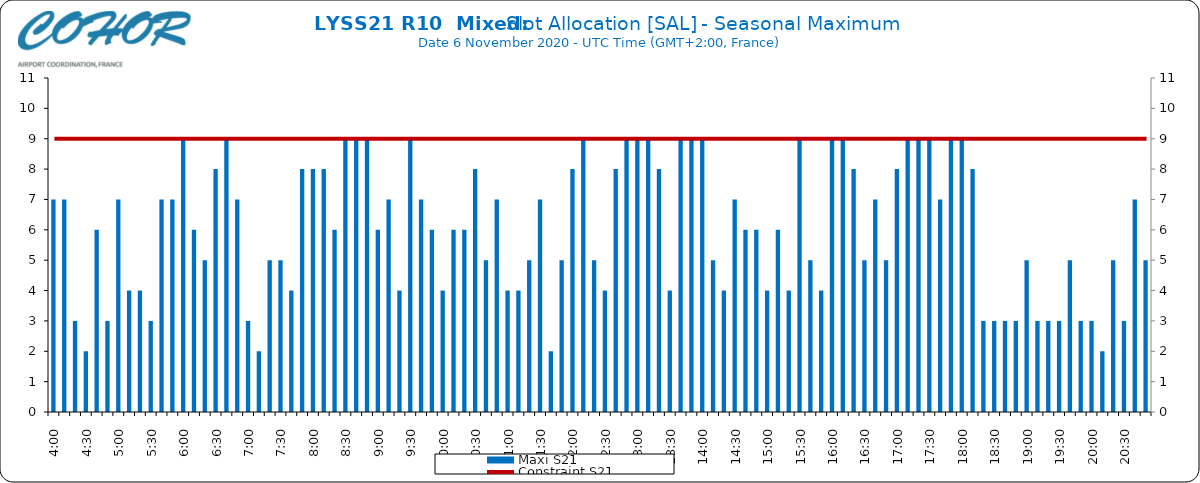
| Category | Maxi S21 |
|---|---|
| 0.16666666666666666 | 7 |
| 0.17361111111111113 | 7 |
| 0.18055555555555555 | 3 |
| 0.1875 | 2 |
| 0.19444444444444445 | 6 |
| 0.20138888888888887 | 3 |
| 0.20833333333333334 | 7 |
| 0.2152777777777778 | 4 |
| 0.2222222222222222 | 4 |
| 0.22916666666666666 | 3 |
| 0.23611111111111113 | 7 |
| 0.24305555555555555 | 7 |
| 0.25 | 9 |
| 0.2569444444444445 | 6 |
| 0.2638888888888889 | 5 |
| 0.2708333333333333 | 8 |
| 0.2777777777777778 | 9 |
| 0.2847222222222222 | 7 |
| 0.2916666666666667 | 3 |
| 0.2986111111111111 | 2 |
| 0.3055555555555555 | 5 |
| 0.3125 | 5 |
| 0.3194444444444445 | 4 |
| 0.3263888888888889 | 8 |
| 0.3333333333333333 | 8 |
| 0.34027777777777773 | 8 |
| 0.34722222222222227 | 6 |
| 0.3541666666666667 | 9 |
| 0.3611111111111111 | 9 |
| 0.3680555555555556 | 9 |
| 0.375 | 6 |
| 0.3819444444444444 | 7 |
| 0.3888888888888889 | 4 |
| 0.3958333333333333 | 9 |
| 0.40277777777777773 | 7 |
| 0.40972222222222227 | 6 |
| 0.4166666666666667 | 4 |
| 0.4236111111111111 | 6 |
| 0.4305555555555556 | 6 |
| 0.4375 | 8 |
| 0.4444444444444444 | 5 |
| 0.4513888888888889 | 7 |
| 0.4583333333333333 | 4 |
| 0.46527777777777773 | 4 |
| 0.47222222222222227 | 5 |
| 0.4791666666666667 | 7 |
| 0.4861111111111111 | 2 |
| 0.4930555555555556 | 5 |
| 0.5 | 8 |
| 0.5069444444444444 | 9 |
| 0.513888888888889 | 5 |
| 0.5208333333333334 | 4 |
| 0.5277777777777778 | 8 |
| 0.5347222222222222 | 9 |
| 0.5416666666666666 | 9 |
| 0.548611111111111 | 9 |
| 0.5555555555555556 | 8 |
| 0.5625 | 4 |
| 0.5694444444444444 | 9 |
| 0.576388888888889 | 9 |
| 0.5833333333333334 | 9 |
| 0.5902777777777778 | 5 |
| 0.5972222222222222 | 4 |
| 0.6041666666666666 | 7 |
| 0.611111111111111 | 6 |
| 0.6180555555555556 | 6 |
| 0.625 | 4 |
| 0.6319444444444444 | 6 |
| 0.638888888888889 | 4 |
| 0.6458333333333334 | 9 |
| 0.6527777777777778 | 5 |
| 0.6597222222222222 | 4 |
| 0.6666666666666666 | 9 |
| 0.6736111111111112 | 9 |
| 0.6805555555555555 | 8 |
| 0.6875 | 5 |
| 0.6944444444444445 | 7 |
| 0.7013888888888888 | 5 |
| 0.7083333333333334 | 8 |
| 0.7152777777777778 | 9 |
| 0.7222222222222222 | 9 |
| 0.7291666666666666 | 9 |
| 0.7361111111111112 | 7 |
| 0.7430555555555555 | 9 |
| 0.75 | 9 |
| 0.7569444444444445 | 8 |
| 0.7638888888888888 | 3 |
| 0.7708333333333334 | 3 |
| 0.7777777777777778 | 3 |
| 0.7847222222222222 | 3 |
| 0.7916666666666666 | 5 |
| 0.7986111111111112 | 3 |
| 0.8055555555555555 | 3 |
| 0.8125 | 3 |
| 0.8194444444444445 | 5 |
| 0.8263888888888888 | 3 |
| 0.8333333333333334 | 3 |
| 0.8402777777777778 | 2 |
| 0.8472222222222222 | 5 |
| 0.8541666666666666 | 3 |
| 0.8611111111111112 | 7 |
| 0.8680555555555555 | 5 |